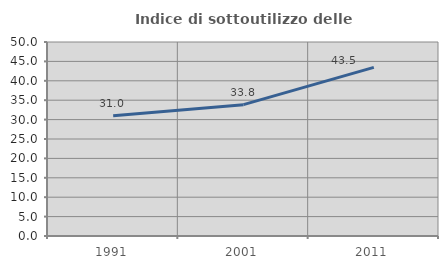
| Category | Indice di sottoutilizzo delle abitazioni  |
|---|---|
| 1991.0 | 31.014 |
| 2001.0 | 33.848 |
| 2011.0 | 43.46 |